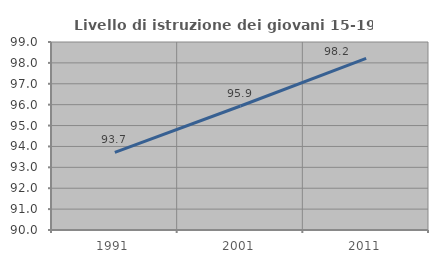
| Category | Livello di istruzione dei giovani 15-19 anni |
|---|---|
| 1991.0 | 93.713 |
| 2001.0 | 95.936 |
| 2011.0 | 98.215 |